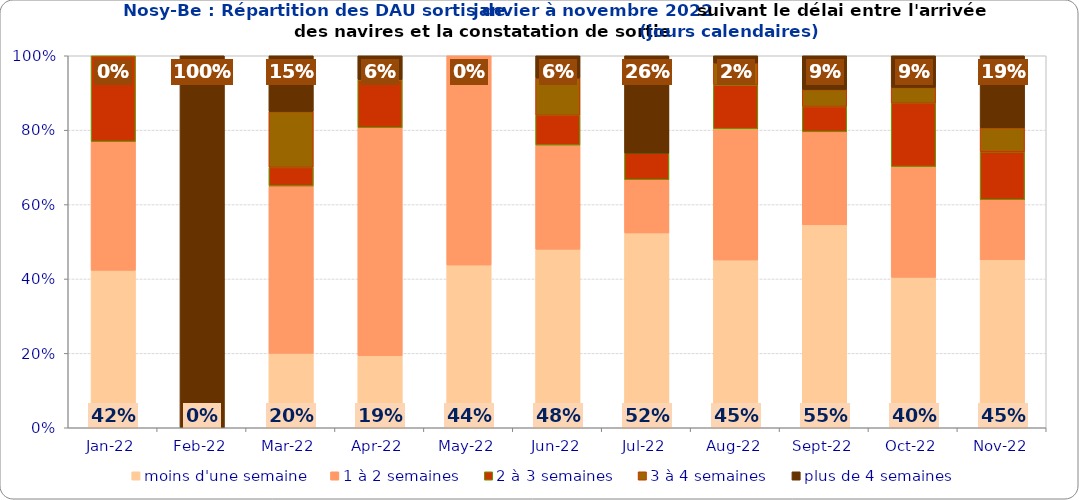
| Category | moins d'une semaine | 1 à 2 semaines | 2 à 3 semaines | 3 à 4 semaines | plus de 4 semaines |
|---|---|---|---|---|---|
| 2022-01-01 | 0.423 | 0.346 | 0.231 | 0 | 0 |
| 2022-02-01 | 0 | 0 | 0 | 0 | 1 |
| 2022-03-01 | 0.2 | 0.45 | 0.05 | 0.15 | 0.15 |
| 2022-04-01 | 0.194 | 0.613 | 0.129 | 0 | 0.065 |
| 2022-05-01 | 0.438 | 0.562 | 0 | 0 | 0 |
| 2022-06-01 | 0.48 | 0.28 | 0.08 | 0.1 | 0.06 |
| 2022-07-01 | 0.524 | 0.143 | 0.071 | 0 | 0.262 |
| 2022-08-01 | 0.451 | 0.353 | 0.118 | 0.059 | 0.02 |
| 2022-09-01 | 0.545 | 0.25 | 0.068 | 0.045 | 0.091 |
| 2022-10-01 | 0.404 | 0.298 | 0.17 | 0.043 | 0.085 |
| 2022-11-01 | 0.452 | 0.161 | 0.129 | 0.065 | 0.194 |